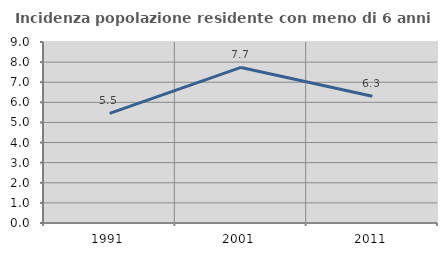
| Category | Incidenza popolazione residente con meno di 6 anni |
|---|---|
| 1991.0 | 5.452 |
| 2001.0 | 7.734 |
| 2011.0 | 6.301 |